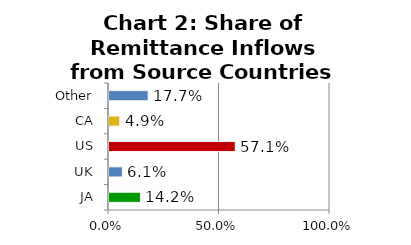
| Category | Chart 2: Share of Remittance Inflows from Source Countries 2022Q1 |
|---|---|
| JA | 0.142 |
| UK | 0.061 |
| US | 0.571 |
| CA | 0.049 |
| Other | 0.177 |